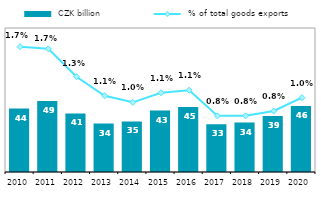
| Category |  CZK billion |
|---|---|
| 2010.0 | 44.08 |
| 2011.0 | 49.246 |
| 2012.0 | 40.656 |
| 2013.0 | 33.61 |
| 2014.0 | 35.112 |
| 2015.0 | 42.707 |
| 2016.0 | 45.144 |
| 2017.0 | 33.101 |
| 2018.0 | 34.371 |
| 2019.0 | 38.808 |
| 2020.0 | 45.845 |